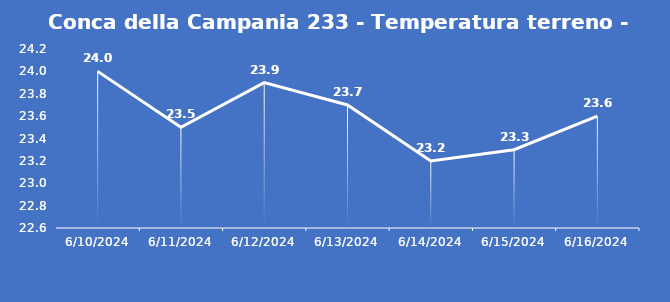
| Category | Conca della Campania 233 - Temperatura terreno - Grezzo (°C) |
|---|---|
| 6/10/24 | 24 |
| 6/11/24 | 23.5 |
| 6/12/24 | 23.9 |
| 6/13/24 | 23.7 |
| 6/14/24 | 23.2 |
| 6/15/24 | 23.3 |
| 6/16/24 | 23.6 |